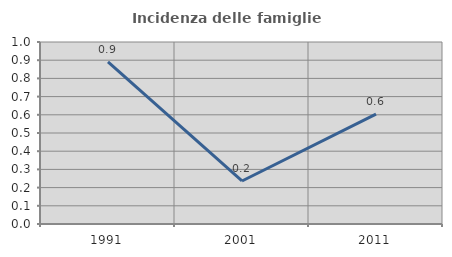
| Category | Incidenza delle famiglie numerose |
|---|---|
| 1991.0 | 0.89 |
| 2001.0 | 0.236 |
| 2011.0 | 0.604 |